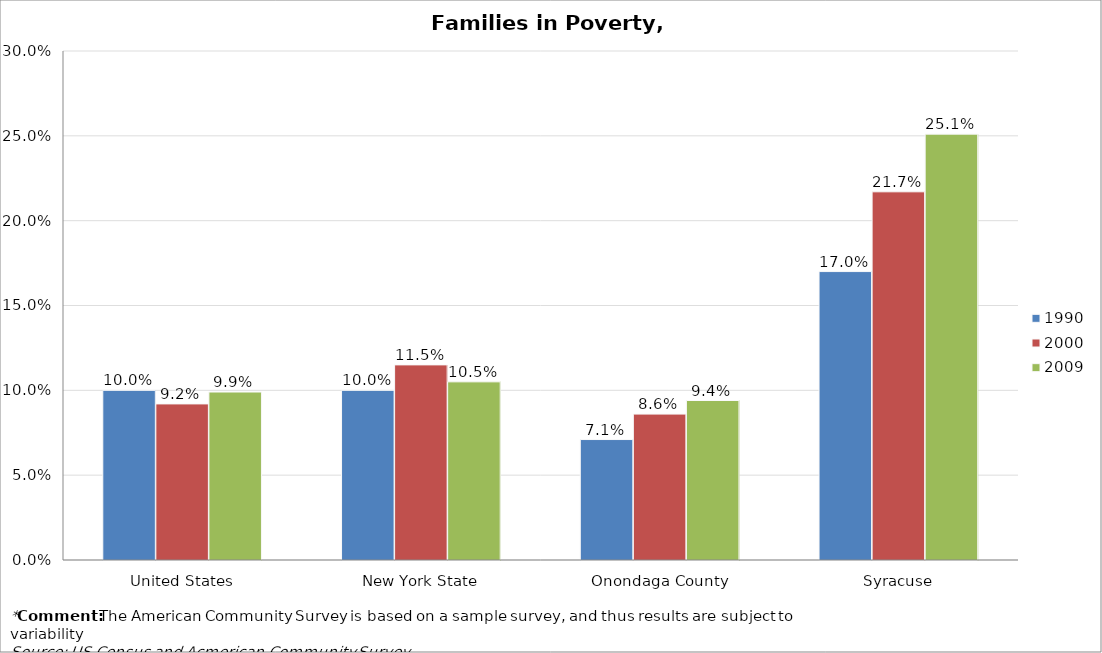
| Category | 1990 | 2000 | 2009 |
|---|---|---|---|
| United States | 0.1 | 0.092 | 0.099 |
| New York State | 0.1 | 0.115 | 0.105 |
| Onondaga County | 0.071 | 0.086 | 0.094 |
| Syracuse | 0.17 | 0.217 | 0.251 |